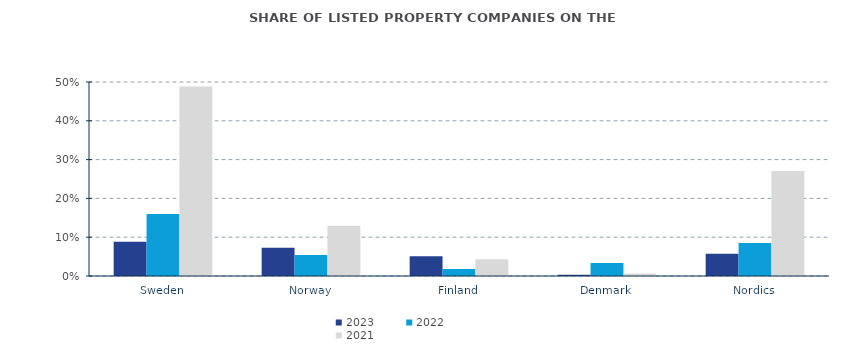
| Category | 2023 | 2022 | 2021 |
|---|---|---|---|
| Sweden | 0.088 | 0.16 | 0.489 |
| Norway | 0.073 | 0.054 | 0.129 |
| Finland | 0.051 | 0.018 | 0.043 |
| Denmark | 0.003 | 0.033 | 0.006 |
| Nordics | 0.057 | 0.085 | 0.271 |